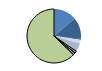
| Category | Series 0 |
|---|---|
| ARRASTRE | 125 |
| CERCO | 115 |
| ATUNEROS CAÑEROS | 5 |
| PALANGRE DE FONDO | 21 |
| PALANGRE DE SUPERFICIE | 39 |
| RASCO | 6 |
| VOLANTA | 11 |
| ARTES FIJAS | 12 |
| ARTES MENORES | 565 |